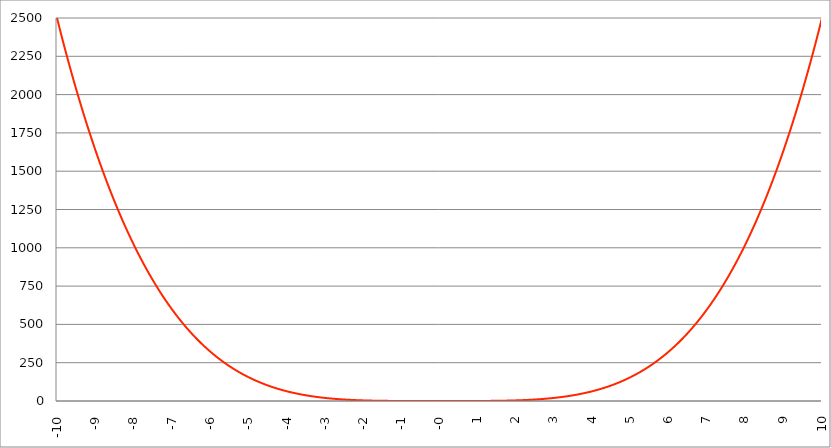
| Category | Series 1 |
|---|---|
| -10.0 | 2500 |
| -9.99 | 2490.015 |
| -9.98 | 2480.06 |
| -9.97 | 2470.135 |
| -9.96 | 2460.239 |
| -9.95 | 2450.374 |
| -9.940000000000001 | 2440.538 |
| -9.930000000000001 | 2430.732 |
| -9.920000000000002 | 2420.955 |
| -9.91 | 2411.208 |
| -9.900000000000002 | 2401.49 |
| -9.890000000000002 | 2391.802 |
| -9.880000000000003 | 2382.143 |
| -9.870000000000003 | 2372.513 |
| -9.860000000000001 | 2362.913 |
| -9.850000000000003 | 2353.341 |
| -9.840000000000003 | 2343.799 |
| -9.830000000000004 | 2334.286 |
| -9.820000000000004 | 2324.802 |
| -9.810000000000004 | 2315.347 |
| -9.800000000000004 | 2305.92 |
| -9.790000000000004 | 2296.523 |
| -9.780000000000005 | 2287.154 |
| -9.770000000000005 | 2277.814 |
| -9.760000000000005 | 2268.503 |
| -9.750000000000005 | 2259.22 |
| -9.740000000000006 | 2249.965 |
| -9.730000000000006 | 2240.739 |
| -9.720000000000006 | 2231.542 |
| -9.710000000000006 | 2222.373 |
| -9.700000000000006 | 2213.232 |
| -9.690000000000007 | 2204.119 |
| -9.680000000000007 | 2195.035 |
| -9.670000000000007 | 2185.979 |
| -9.660000000000007 | 2176.95 |
| -9.650000000000007 | 2167.95 |
| -9.640000000000008 | 2158.978 |
| -9.630000000000008 | 2150.033 |
| -9.620000000000008 | 2141.116 |
| -9.610000000000008 | 2132.228 |
| -9.600000000000009 | 2123.366 |
| -9.590000000000009 | 2114.533 |
| -9.580000000000007 | 2105.727 |
| -9.57000000000001 | 2096.948 |
| -9.56000000000001 | 2088.198 |
| -9.55000000000001 | 2079.474 |
| -9.54000000000001 | 2070.778 |
| -9.53000000000001 | 2062.109 |
| -9.52000000000001 | 2053.467 |
| -9.51000000000001 | 2044.853 |
| -9.50000000000001 | 2036.266 |
| -9.49000000000001 | 2027.705 |
| -9.48000000000001 | 2019.172 |
| -9.47000000000001 | 2010.666 |
| -9.46000000000001 | 2002.187 |
| -9.45000000000001 | 1993.734 |
| -9.44000000000001 | 1985.308 |
| -9.430000000000012 | 1976.909 |
| -9.420000000000012 | 1968.537 |
| -9.410000000000013 | 1960.192 |
| -9.400000000000013 | 1951.872 |
| -9.390000000000011 | 1943.58 |
| -9.380000000000013 | 1935.314 |
| -9.370000000000013 | 1927.074 |
| -9.360000000000014 | 1918.861 |
| -9.350000000000014 | 1910.673 |
| -9.340000000000014 | 1902.512 |
| -9.330000000000014 | 1894.378 |
| -9.320000000000014 | 1886.269 |
| -9.310000000000015 | 1878.187 |
| -9.300000000000013 | 1870.13 |
| -9.290000000000015 | 1862.099 |
| -9.280000000000015 | 1854.095 |
| -9.270000000000016 | 1846.116 |
| -9.260000000000016 | 1838.163 |
| -9.250000000000014 | 1830.235 |
| -9.240000000000016 | 1822.334 |
| -9.230000000000016 | 1814.458 |
| -9.220000000000017 | 1806.607 |
| -9.210000000000017 | 1798.782 |
| -9.200000000000017 | 1790.982 |
| -9.190000000000017 | 1783.208 |
| -9.180000000000017 | 1775.459 |
| -9.170000000000018 | 1767.736 |
| -9.160000000000016 | 1760.037 |
| -9.150000000000018 | 1752.364 |
| -9.140000000000018 | 1744.716 |
| -9.130000000000019 | 1737.093 |
| -9.120000000000019 | 1729.495 |
| -9.110000000000017 | 1721.922 |
| -9.10000000000002 | 1714.374 |
| -9.09000000000002 | 1706.851 |
| -9.08000000000002 | 1699.352 |
| -9.07000000000002 | 1691.878 |
| -9.06000000000002 | 1684.429 |
| -9.05000000000002 | 1677.005 |
| -9.04000000000002 | 1669.605 |
| -9.03000000000002 | 1662.23 |
| -9.020000000000021 | 1654.879 |
| -9.010000000000021 | 1647.552 |
| -9.000000000000021 | 1640.25 |
| -8.990000000000022 | 1632.972 |
| -8.980000000000022 | 1625.719 |
| -8.97000000000002 | 1618.489 |
| -8.960000000000022 | 1611.284 |
| -8.950000000000022 | 1604.103 |
| -8.940000000000023 | 1596.945 |
| -8.930000000000023 | 1589.812 |
| -8.920000000000023 | 1582.703 |
| -8.910000000000023 | 1575.618 |
| -8.900000000000023 | 1568.556 |
| -8.890000000000024 | 1561.518 |
| -8.880000000000024 | 1554.504 |
| -8.870000000000024 | 1547.514 |
| -8.860000000000024 | 1540.547 |
| -8.850000000000025 | 1533.604 |
| -8.840000000000025 | 1526.684 |
| -8.830000000000025 | 1519.787 |
| -8.820000000000025 | 1512.914 |
| -8.810000000000025 | 1506.065 |
| -8.800000000000026 | 1499.238 |
| -8.790000000000026 | 1492.435 |
| -8.780000000000026 | 1485.655 |
| -8.770000000000026 | 1478.899 |
| -8.760000000000026 | 1472.165 |
| -8.750000000000027 | 1465.454 |
| -8.740000000000027 | 1458.766 |
| -8.730000000000027 | 1452.102 |
| -8.720000000000027 | 1445.46 |
| -8.710000000000027 | 1438.84 |
| -8.700000000000028 | 1432.244 |
| -8.690000000000028 | 1425.67 |
| -8.680000000000028 | 1419.119 |
| -8.670000000000028 | 1412.591 |
| -8.660000000000029 | 1406.085 |
| -8.650000000000029 | 1399.602 |
| -8.640000000000029 | 1393.141 |
| -8.63000000000003 | 1386.702 |
| -8.62000000000003 | 1380.286 |
| -8.61000000000003 | 1373.892 |
| -8.60000000000003 | 1367.52 |
| -8.59000000000003 | 1361.171 |
| -8.58000000000003 | 1354.844 |
| -8.57000000000003 | 1348.538 |
| -8.56000000000003 | 1342.255 |
| -8.55000000000003 | 1335.994 |
| -8.540000000000031 | 1329.755 |
| -8.530000000000031 | 1323.537 |
| -8.520000000000032 | 1317.342 |
| -8.510000000000032 | 1311.168 |
| -8.50000000000003 | 1305.016 |
| -8.490000000000032 | 1298.885 |
| -8.480000000000032 | 1292.776 |
| -8.470000000000033 | 1286.689 |
| -8.460000000000033 | 1280.623 |
| -8.450000000000033 | 1274.579 |
| -8.440000000000033 | 1268.556 |
| -8.430000000000033 | 1262.555 |
| -8.420000000000034 | 1256.575 |
| -8.410000000000032 | 1250.616 |
| -8.400000000000034 | 1244.678 |
| -8.390000000000034 | 1238.762 |
| -8.380000000000035 | 1232.867 |
| -8.370000000000035 | 1226.992 |
| -8.360000000000033 | 1221.139 |
| -8.350000000000035 | 1215.307 |
| -8.340000000000035 | 1209.495 |
| -8.330000000000036 | 1203.705 |
| -8.320000000000036 | 1197.935 |
| -8.310000000000034 | 1192.186 |
| -8.300000000000036 | 1186.458 |
| -8.290000000000036 | 1180.75 |
| -8.280000000000037 | 1175.064 |
| -8.270000000000037 | 1169.397 |
| -8.260000000000037 | 1163.751 |
| -8.250000000000037 | 1158.126 |
| -8.240000000000038 | 1152.521 |
| -8.230000000000038 | 1146.936 |
| -8.220000000000038 | 1141.372 |
| -8.210000000000038 | 1135.828 |
| -8.200000000000038 | 1130.304 |
| -8.190000000000039 | 1124.801 |
| -8.180000000000039 | 1119.317 |
| -8.170000000000037 | 1113.854 |
| -8.16000000000004 | 1108.411 |
| -8.15000000000004 | 1102.987 |
| -8.14000000000004 | 1097.584 |
| -8.13000000000004 | 1092.2 |
| -8.12000000000004 | 1086.836 |
| -8.11000000000004 | 1081.492 |
| -8.10000000000004 | 1076.168 |
| -8.09000000000004 | 1070.863 |
| -8.08000000000004 | 1065.579 |
| -8.07000000000004 | 1060.313 |
| -8.06000000000004 | 1055.067 |
| -8.05000000000004 | 1049.841 |
| -8.040000000000042 | 1044.634 |
| -8.03000000000004 | 1039.447 |
| -8.020000000000042 | 1034.278 |
| -8.010000000000042 | 1029.13 |
| -8.000000000000043 | 1024 |
| -7.990000000000043 | 1018.89 |
| -7.980000000000043 | 1013.798 |
| -7.970000000000043 | 1008.726 |
| -7.960000000000043 | 1003.673 |
| -7.950000000000044 | 998.639 |
| -7.940000000000044 | 993.624 |
| -7.930000000000044 | 988.628 |
| -7.920000000000044 | 983.65 |
| -7.910000000000044 | 978.692 |
| -7.900000000000044 | 973.752 |
| -7.890000000000045 | 968.831 |
| -7.880000000000045 | 963.929 |
| -7.870000000000045 | 959.045 |
| -7.860000000000046 | 954.18 |
| -7.850000000000046 | 949.333 |
| -7.840000000000046 | 944.505 |
| -7.830000000000046 | 939.695 |
| -7.820000000000046 | 934.904 |
| -7.810000000000047 | 930.131 |
| -7.800000000000047 | 925.376 |
| -7.790000000000047 | 920.64 |
| -7.780000000000047 | 915.922 |
| -7.770000000000047 | 911.222 |
| -7.760000000000048 | 906.54 |
| -7.750000000000048 | 901.876 |
| -7.740000000000048 | 897.23 |
| -7.730000000000048 | 892.602 |
| -7.720000000000049 | 887.992 |
| -7.710000000000049 | 883.4 |
| -7.700000000000049 | 878.826 |
| -7.690000000000049 | 874.27 |
| -7.680000000000049 | 869.731 |
| -7.67000000000005 | 865.21 |
| -7.66000000000005 | 860.707 |
| -7.65000000000005 | 856.221 |
| -7.64000000000005 | 851.753 |
| -7.63000000000005 | 847.302 |
| -7.620000000000051 | 842.869 |
| -7.610000000000051 | 838.453 |
| -7.600000000000051 | 834.054 |
| -7.590000000000051 | 829.673 |
| -7.580000000000052 | 825.309 |
| -7.570000000000052 | 820.963 |
| -7.560000000000052 | 816.633 |
| -7.550000000000052 | 812.321 |
| -7.540000000000052 | 808.026 |
| -7.530000000000053 | 803.748 |
| -7.520000000000053 | 799.487 |
| -7.510000000000053 | 795.243 |
| -7.500000000000053 | 791.016 |
| -7.490000000000053 | 786.805 |
| -7.480000000000054 | 782.612 |
| -7.470000000000054 | 778.435 |
| -7.460000000000054 | 774.275 |
| -7.450000000000054 | 770.132 |
| -7.440000000000054 | 766.005 |
| -7.430000000000054 | 761.895 |
| -7.420000000000055 | 757.802 |
| -7.410000000000055 | 753.725 |
| -7.400000000000055 | 749.664 |
| -7.390000000000056 | 745.62 |
| -7.380000000000056 | 741.593 |
| -7.370000000000056 | 737.581 |
| -7.360000000000056 | 733.586 |
| -7.350000000000056 | 729.608 |
| -7.340000000000057 | 725.645 |
| -7.330000000000057 | 721.699 |
| -7.320000000000057 | 717.768 |
| -7.310000000000057 | 713.854 |
| -7.300000000000058 | 709.956 |
| -7.290000000000058 | 706.074 |
| -7.280000000000058 | 702.208 |
| -7.270000000000058 | 698.357 |
| -7.260000000000058 | 694.523 |
| -7.250000000000059 | 690.704 |
| -7.240000000000059 | 686.901 |
| -7.23000000000006 | 683.114 |
| -7.220000000000059 | 679.343 |
| -7.210000000000059 | 675.587 |
| -7.20000000000006 | 671.846 |
| -7.19000000000006 | 668.122 |
| -7.18000000000006 | 664.412 |
| -7.17000000000006 | 660.719 |
| -7.160000000000061 | 657.04 |
| -7.150000000000061 | 653.378 |
| -7.140000000000061 | 649.73 |
| -7.130000000000061 | 646.098 |
| -7.120000000000061 | 642.481 |
| -7.110000000000062 | 638.879 |
| -7.100000000000062 | 635.292 |
| -7.090000000000062 | 631.72 |
| -7.080000000000062 | 628.164 |
| -7.070000000000062 | 624.623 |
| -7.060000000000063 | 621.096 |
| -7.050000000000063 | 617.585 |
| -7.040000000000063 | 614.088 |
| -7.030000000000063 | 610.606 |
| -7.020000000000064 | 607.139 |
| -7.010000000000064 | 603.687 |
| -7.000000000000064 | 600.25 |
| -6.990000000000064 | 596.827 |
| -6.980000000000064 | 593.419 |
| -6.970000000000064 | 590.026 |
| -6.960000000000064 | 586.647 |
| -6.950000000000064 | 583.283 |
| -6.940000000000065 | 579.933 |
| -6.930000000000065 | 576.598 |
| -6.920000000000065 | 573.277 |
| -6.910000000000065 | 569.97 |
| -6.900000000000066 | 566.678 |
| -6.890000000000066 | 563.4 |
| -6.880000000000066 | 560.136 |
| -6.870000000000066 | 556.887 |
| -6.860000000000067 | 553.651 |
| -6.850000000000067 | 550.43 |
| -6.840000000000067 | 547.223 |
| -6.830000000000067 | 544.03 |
| -6.820000000000068 | 540.851 |
| -6.810000000000068 | 537.686 |
| -6.800000000000068 | 534.534 |
| -6.790000000000068 | 531.397 |
| -6.780000000000068 | 528.273 |
| -6.770000000000068 | 525.164 |
| -6.760000000000069 | 522.068 |
| -6.75000000000007 | 518.985 |
| -6.74000000000007 | 515.917 |
| -6.73000000000007 | 512.862 |
| -6.72000000000007 | 509.82 |
| -6.71000000000007 | 506.792 |
| -6.70000000000007 | 503.778 |
| -6.69000000000007 | 500.777 |
| -6.680000000000071 | 497.79 |
| -6.670000000000071 | 494.816 |
| -6.660000000000071 | 491.855 |
| -6.650000000000071 | 488.907 |
| -6.640000000000072 | 485.973 |
| -6.630000000000072 | 483.052 |
| -6.620000000000072 | 480.145 |
| -6.610000000000072 | 477.25 |
| -6.600000000000072 | 474.368 |
| -6.590000000000073 | 471.5 |
| -6.580000000000073 | 468.645 |
| -6.570000000000073 | 465.802 |
| -6.560000000000073 | 462.973 |
| -6.550000000000074 | 460.156 |
| -6.540000000000074 | 457.352 |
| -6.530000000000074 | 454.562 |
| -6.520000000000074 | 451.784 |
| -6.510000000000074 | 449.018 |
| -6.500000000000074 | 446.266 |
| -6.490000000000074 | 443.526 |
| -6.480000000000074 | 440.798 |
| -6.470000000000075 | 438.084 |
| -6.460000000000075 | 435.382 |
| -6.450000000000075 | 432.692 |
| -6.440000000000075 | 430.015 |
| -6.430000000000076 | 427.35 |
| -6.420000000000076 | 424.698 |
| -6.410000000000076 | 422.058 |
| -6.400000000000076 | 419.43 |
| -6.390000000000077 | 416.815 |
| -6.380000000000077 | 414.212 |
| -6.370000000000077 | 411.621 |
| -6.360000000000078 | 409.043 |
| -6.350000000000078 | 406.476 |
| -6.340000000000078 | 403.922 |
| -6.330000000000078 | 401.379 |
| -6.320000000000078 | 398.849 |
| -6.310000000000079 | 396.33 |
| -6.300000000000079 | 393.824 |
| -6.29000000000008 | 391.33 |
| -6.28000000000008 | 388.847 |
| -6.27000000000008 | 386.376 |
| -6.26000000000008 | 383.917 |
| -6.25000000000008 | 381.47 |
| -6.24000000000008 | 379.034 |
| -6.23000000000008 | 376.61 |
| -6.220000000000081 | 374.198 |
| -6.210000000000081 | 371.797 |
| -6.200000000000081 | 369.408 |
| -6.190000000000081 | 367.031 |
| -6.180000000000081 | 364.665 |
| -6.170000000000082 | 362.31 |
| -6.160000000000082 | 359.967 |
| -6.150000000000082 | 357.635 |
| -6.140000000000082 | 355.315 |
| -6.130000000000082 | 353.006 |
| -6.120000000000083 | 350.708 |
| -6.110000000000083 | 348.421 |
| -6.100000000000083 | 346.146 |
| -6.090000000000083 | 343.882 |
| -6.080000000000084 | 341.629 |
| -6.070000000000084 | 339.387 |
| -6.060000000000084 | 337.156 |
| -6.050000000000084 | 334.936 |
| -6.040000000000084 | 332.727 |
| -6.030000000000084 | 330.529 |
| -6.020000000000085 | 328.342 |
| -6.010000000000085 | 326.165 |
| -6.000000000000085 | 324 |
| -5.990000000000085 | 321.845 |
| -5.980000000000085 | 319.702 |
| -5.970000000000085 | 317.568 |
| -5.960000000000086 | 315.446 |
| -5.950000000000086 | 313.334 |
| -5.940000000000086 | 311.233 |
| -5.930000000000086 | 309.143 |
| -5.920000000000087 | 307.063 |
| -5.910000000000087 | 304.993 |
| -5.900000000000087 | 302.934 |
| -5.890000000000088 | 300.885 |
| -5.880000000000088 | 298.847 |
| -5.870000000000088 | 296.819 |
| -5.860000000000088 | 294.802 |
| -5.850000000000088 | 292.795 |
| -5.840000000000089 | 290.798 |
| -5.830000000000089 | 288.811 |
| -5.820000000000089 | 286.835 |
| -5.810000000000089 | 284.869 |
| -5.800000000000089 | 282.912 |
| -5.79000000000009 | 280.966 |
| -5.78000000000009 | 279.03 |
| -5.77000000000009 | 277.104 |
| -5.76000000000009 | 275.188 |
| -5.750000000000091 | 273.282 |
| -5.740000000000091 | 271.386 |
| -5.730000000000091 | 269.5 |
| -5.720000000000091 | 267.623 |
| -5.710000000000091 | 265.757 |
| -5.700000000000092 | 263.9 |
| -5.690000000000092 | 262.053 |
| -5.680000000000092 | 260.216 |
| -5.670000000000092 | 258.388 |
| -5.660000000000092 | 256.57 |
| -5.650000000000093 | 254.762 |
| -5.640000000000093 | 252.963 |
| -5.630000000000093 | 251.173 |
| -5.620000000000093 | 249.394 |
| -5.610000000000093 | 247.623 |
| -5.600000000000094 | 245.862 |
| -5.590000000000094 | 244.111 |
| -5.580000000000094 | 242.369 |
| -5.570000000000094 | 240.636 |
| -5.560000000000095 | 238.913 |
| -5.550000000000095 | 237.199 |
| -5.540000000000095 | 235.494 |
| -5.530000000000095 | 233.798 |
| -5.520000000000095 | 232.111 |
| -5.510000000000096 | 230.434 |
| -5.500000000000096 | 228.766 |
| -5.490000000000096 | 227.106 |
| -5.480000000000096 | 225.456 |
| -5.470000000000096 | 223.815 |
| -5.460000000000097 | 222.183 |
| -5.450000000000097 | 220.56 |
| -5.440000000000097 | 218.945 |
| -5.430000000000097 | 217.34 |
| -5.420000000000098 | 215.743 |
| -5.410000000000098 | 214.155 |
| -5.400000000000098 | 212.576 |
| -5.390000000000098 | 211.006 |
| -5.380000000000098 | 209.445 |
| -5.370000000000099 | 207.892 |
| -5.360000000000099 | 206.347 |
| -5.350000000000099 | 204.812 |
| -5.340000000000099 | 203.285 |
| -5.330000000000099 | 201.766 |
| -5.3200000000001 | 200.256 |
| -5.3100000000001 | 198.755 |
| -5.3000000000001 | 197.262 |
| -5.2900000000001 | 195.777 |
| -5.2800000000001 | 194.301 |
| -5.2700000000001 | 192.833 |
| -5.260000000000101 | 191.374 |
| -5.250000000000101 | 189.923 |
| -5.240000000000101 | 188.48 |
| -5.230000000000101 | 187.045 |
| -5.220000000000102 | 185.619 |
| -5.210000000000102 | 184.201 |
| -5.200000000000102 | 182.79 |
| -5.190000000000103 | 181.388 |
| -5.180000000000103 | 179.994 |
| -5.170000000000103 | 178.609 |
| -5.160000000000103 | 177.231 |
| -5.150000000000103 | 175.861 |
| -5.140000000000104 | 174.499 |
| -5.130000000000104 | 173.145 |
| -5.120000000000104 | 171.799 |
| -5.110000000000104 | 170.46 |
| -5.100000000000104 | 169.13 |
| -5.090000000000104 | 167.807 |
| -5.080000000000104 | 166.493 |
| -5.070000000000105 | 165.185 |
| -5.060000000000105 | 163.886 |
| -5.050000000000105 | 162.594 |
| -5.040000000000105 | 161.31 |
| -5.030000000000105 | 160.034 |
| -5.020000000000106 | 158.765 |
| -5.010000000000106 | 157.504 |
| -5.000000000000106 | 156.25 |
| -4.990000000000106 | 155.004 |
| -4.980000000000106 | 153.765 |
| -4.970000000000107 | 152.534 |
| -4.960000000000107 | 151.31 |
| -4.950000000000107 | 150.093 |
| -4.940000000000107 | 148.884 |
| -4.930000000000108 | 147.682 |
| -4.920000000000108 | 146.487 |
| -4.910000000000108 | 145.3 |
| -4.900000000000108 | 144.12 |
| -4.890000000000109 | 142.947 |
| -4.88000000000011 | 141.781 |
| -4.87000000000011 | 140.623 |
| -4.86000000000011 | 139.471 |
| -4.85000000000011 | 138.327 |
| -4.84000000000011 | 137.19 |
| -4.83000000000011 | 136.059 |
| -4.82000000000011 | 134.936 |
| -4.810000000000111 | 133.82 |
| -4.800000000000111 | 132.71 |
| -4.790000000000111 | 131.608 |
| -4.780000000000111 | 130.512 |
| -4.770000000000111 | 129.424 |
| -4.760000000000112 | 128.342 |
| -4.750000000000112 | 127.267 |
| -4.740000000000112 | 126.198 |
| -4.730000000000112 | 125.137 |
| -4.720000000000112 | 124.082 |
| -4.710000000000113 | 123.034 |
| -4.700000000000113 | 121.992 |
| -4.690000000000113 | 120.957 |
| -4.680000000000113 | 119.929 |
| -4.670000000000114 | 118.907 |
| -4.660000000000114 | 117.892 |
| -4.650000000000114 | 116.883 |
| -4.640000000000114 | 115.881 |
| -4.630000000000114 | 114.885 |
| -4.620000000000115 | 113.896 |
| -4.610000000000115 | 112.913 |
| -4.600000000000115 | 111.936 |
| -4.590000000000115 | 110.966 |
| -4.580000000000115 | 110.002 |
| -4.570000000000115 | 109.045 |
| -4.560000000000116 | 108.093 |
| -4.550000000000116 | 107.148 |
| -4.540000000000116 | 106.21 |
| -4.530000000000116 | 105.277 |
| -4.520000000000117 | 104.35 |
| -4.510000000000117 | 103.43 |
| -4.500000000000117 | 102.516 |
| -4.490000000000117 | 101.607 |
| -4.480000000000117 | 100.705 |
| -4.470000000000117 | 99.809 |
| -4.460000000000118 | 98.919 |
| -4.450000000000118 | 98.035 |
| -4.440000000000118 | 97.157 |
| -4.430000000000118 | 96.284 |
| -4.420000000000119 | 95.418 |
| -4.41000000000012 | 94.557 |
| -4.40000000000012 | 93.702 |
| -4.39000000000012 | 92.853 |
| -4.38000000000012 | 92.01 |
| -4.37000000000012 | 91.173 |
| -4.36000000000012 | 90.341 |
| -4.35000000000012 | 89.515 |
| -4.34000000000012 | 88.695 |
| -4.33000000000012 | 87.88 |
| -4.320000000000121 | 87.071 |
| -4.310000000000121 | 86.268 |
| -4.300000000000121 | 85.47 |
| -4.290000000000121 | 84.678 |
| -4.280000000000121 | 83.891 |
| -4.270000000000122 | 83.11 |
| -4.260000000000122 | 82.334 |
| -4.250000000000122 | 81.563 |
| -4.240000000000122 | 80.799 |
| -4.230000000000122 | 80.039 |
| -4.220000000000123 | 79.285 |
| -4.210000000000123 | 78.536 |
| -4.200000000000123 | 77.792 |
| -4.190000000000124 | 77.054 |
| -4.180000000000124 | 76.321 |
| -4.170000000000124 | 75.593 |
| -4.160000000000124 | 74.871 |
| -4.150000000000124 | 74.154 |
| -4.140000000000124 | 73.441 |
| -4.130000000000125 | 72.734 |
| -4.120000000000125 | 72.033 |
| -4.110000000000125 | 71.336 |
| -4.100000000000125 | 70.644 |
| -4.090000000000125 | 69.957 |
| -4.080000000000126 | 69.276 |
| -4.070000000000126 | 68.599 |
| -4.060000000000126 | 67.927 |
| -4.050000000000126 | 67.261 |
| -4.040000000000127 | 66.599 |
| -4.030000000000127 | 65.942 |
| -4.020000000000127 | 65.29 |
| -4.010000000000127 | 64.642 |
| -4.000000000000127 | 64 |
| -3.990000000000128 | 63.362 |
| -3.980000000000128 | 62.73 |
| -3.970000000000129 | 62.101 |
| -3.960000000000129 | 61.478 |
| -3.950000000000129 | 60.86 |
| -3.940000000000129 | 60.246 |
| -3.930000000000129 | 59.636 |
| -3.92000000000013 | 59.032 |
| -3.91000000000013 | 58.432 |
| -3.90000000000013 | 57.836 |
| -3.89000000000013 | 57.245 |
| -3.88000000000013 | 56.659 |
| -3.870000000000131 | 56.077 |
| -3.860000000000131 | 55.5 |
| -3.850000000000131 | 54.927 |
| -3.840000000000131 | 54.358 |
| -3.830000000000131 | 53.794 |
| -3.820000000000132 | 53.235 |
| -3.810000000000132 | 52.679 |
| -3.800000000000132 | 52.128 |
| -3.790000000000132 | 51.582 |
| -3.780000000000132 | 51.04 |
| -3.770000000000133 | 50.502 |
| -3.760000000000133 | 49.968 |
| -3.750000000000133 | 49.438 |
| -3.740000000000133 | 48.913 |
| -3.730000000000134 | 48.392 |
| -3.720000000000134 | 47.875 |
| -3.710000000000134 | 47.363 |
| -3.700000000000134 | 46.854 |
| -3.690000000000134 | 46.35 |
| -3.680000000000135 | 45.849 |
| -3.670000000000135 | 45.353 |
| -3.660000000000135 | 44.861 |
| -3.650000000000135 | 44.372 |
| -3.640000000000135 | 43.888 |
| -3.630000000000136 | 43.408 |
| -3.620000000000136 | 42.931 |
| -3.610000000000136 | 42.459 |
| -3.600000000000136 | 41.99 |
| -3.590000000000137 | 41.526 |
| -3.580000000000137 | 41.065 |
| -3.570000000000137 | 40.608 |
| -3.560000000000137 | 40.155 |
| -3.550000000000137 | 39.706 |
| -3.540000000000138 | 39.26 |
| -3.530000000000138 | 38.819 |
| -3.520000000000138 | 38.381 |
| -3.510000000000138 | 37.946 |
| -3.500000000000139 | 37.516 |
| -3.490000000000139 | 37.089 |
| -3.480000000000139 | 36.665 |
| -3.470000000000139 | 36.246 |
| -3.460000000000139 | 35.83 |
| -3.45000000000014 | 35.417 |
| -3.44000000000014 | 35.009 |
| -3.43000000000014 | 34.603 |
| -3.42000000000014 | 34.201 |
| -3.41000000000014 | 33.803 |
| -3.400000000000141 | 33.408 |
| -3.390000000000141 | 33.017 |
| -3.380000000000141 | 32.629 |
| -3.370000000000141 | 32.245 |
| -3.360000000000141 | 31.864 |
| -3.350000000000142 | 31.486 |
| -3.340000000000142 | 31.112 |
| -3.330000000000142 | 30.741 |
| -3.320000000000142 | 30.373 |
| -3.310000000000143 | 30.009 |
| -3.300000000000143 | 29.648 |
| -3.290000000000143 | 29.29 |
| -3.280000000000143 | 28.936 |
| -3.270000000000143 | 28.585 |
| -3.260000000000144 | 28.236 |
| -3.250000000000144 | 27.892 |
| -3.240000000000144 | 27.55 |
| -3.230000000000144 | 27.211 |
| -3.220000000000145 | 26.876 |
| -3.210000000000145 | 26.544 |
| -3.200000000000145 | 26.214 |
| -3.190000000000145 | 25.888 |
| -3.180000000000145 | 25.565 |
| -3.170000000000146 | 25.245 |
| -3.160000000000146 | 24.928 |
| -3.150000000000146 | 24.614 |
| -3.140000000000146 | 24.303 |
| -3.130000000000146 | 23.995 |
| -3.120000000000147 | 23.69 |
| -3.110000000000147 | 23.387 |
| -3.100000000000147 | 23.088 |
| -3.090000000000147 | 22.792 |
| -3.080000000000147 | 22.498 |
| -3.070000000000148 | 22.207 |
| -3.060000000000148 | 21.919 |
| -3.050000000000148 | 21.634 |
| -3.040000000000148 | 21.352 |
| -3.030000000000149 | 21.072 |
| -3.020000000000149 | 20.795 |
| -3.010000000000149 | 20.521 |
| -3.000000000000149 | 20.25 |
| -2.990000000000149 | 19.981 |
| -2.98000000000015 | 19.715 |
| -2.97000000000015 | 19.452 |
| -2.96000000000015 | 19.191 |
| -2.95000000000015 | 18.933 |
| -2.94000000000015 | 18.678 |
| -2.930000000000151 | 18.425 |
| -2.920000000000151 | 18.175 |
| -2.910000000000151 | 17.927 |
| -2.900000000000151 | 17.682 |
| -2.890000000000151 | 17.439 |
| -2.880000000000152 | 17.199 |
| -2.870000000000152 | 16.962 |
| -2.860000000000152 | 16.726 |
| -2.850000000000152 | 16.494 |
| -2.840000000000153 | 16.263 |
| -2.830000000000153 | 16.036 |
| -2.820000000000153 | 15.81 |
| -2.810000000000153 | 15.587 |
| -2.800000000000153 | 15.366 |
| -2.790000000000154 | 15.148 |
| -2.780000000000154 | 14.932 |
| -2.770000000000154 | 14.718 |
| -2.760000000000154 | 14.507 |
| -2.750000000000154 | 14.298 |
| -2.740000000000155 | 14.091 |
| -2.730000000000155 | 13.886 |
| -2.720000000000155 | 13.684 |
| -2.710000000000155 | 13.484 |
| -2.700000000000156 | 13.286 |
| -2.690000000000156 | 13.09 |
| -2.680000000000156 | 12.897 |
| -2.670000000000156 | 12.705 |
| -2.660000000000156 | 12.516 |
| -2.650000000000157 | 12.329 |
| -2.640000000000157 | 12.144 |
| -2.630000000000157 | 11.961 |
| -2.620000000000157 | 11.78 |
| -2.610000000000157 | 11.601 |
| -2.600000000000158 | 11.424 |
| -2.590000000000158 | 11.25 |
| -2.580000000000158 | 11.077 |
| -2.570000000000158 | 10.906 |
| -2.560000000000159 | 10.737 |
| -2.550000000000159 | 10.571 |
| -2.54000000000016 | 10.406 |
| -2.530000000000159 | 10.243 |
| -2.520000000000159 | 10.082 |
| -2.51000000000016 | 9.923 |
| -2.50000000000016 | 9.766 |
| -2.49000000000016 | 9.61 |
| -2.48000000000016 | 9.457 |
| -2.47000000000016 | 9.305 |
| -2.460000000000161 | 9.155 |
| -2.450000000000161 | 9.008 |
| -2.440000000000161 | 8.861 |
| -2.430000000000161 | 8.717 |
| -2.420000000000162 | 8.574 |
| -2.410000000000162 | 8.434 |
| -2.400000000000162 | 8.294 |
| -2.390000000000162 | 8.157 |
| -2.380000000000162 | 8.021 |
| -2.370000000000163 | 7.887 |
| -2.360000000000163 | 7.755 |
| -2.350000000000163 | 7.625 |
| -2.340000000000163 | 7.496 |
| -2.330000000000163 | 7.368 |
| -2.320000000000164 | 7.243 |
| -2.310000000000164 | 7.118 |
| -2.300000000000164 | 6.996 |
| -2.290000000000164 | 6.875 |
| -2.280000000000165 | 6.756 |
| -2.270000000000165 | 6.638 |
| -2.260000000000165 | 6.522 |
| -2.250000000000165 | 6.407 |
| -2.240000000000165 | 6.294 |
| -2.230000000000166 | 6.182 |
| -2.220000000000166 | 6.072 |
| -2.210000000000166 | 5.964 |
| -2.200000000000166 | 5.856 |
| -2.190000000000166 | 5.751 |
| -2.180000000000167 | 5.646 |
| -2.170000000000167 | 5.543 |
| -2.160000000000167 | 5.442 |
| -2.150000000000167 | 5.342 |
| -2.140000000000168 | 5.243 |
| -2.130000000000168 | 5.146 |
| -2.120000000000168 | 5.05 |
| -2.110000000000168 | 4.955 |
| -2.100000000000168 | 4.862 |
| -2.090000000000169 | 4.77 |
| -2.080000000000169 | 4.679 |
| -2.070000000000169 | 4.59 |
| -2.060000000000169 | 4.502 |
| -2.050000000000169 | 4.415 |
| -2.04000000000017 | 4.33 |
| -2.03000000000017 | 4.245 |
| -2.02000000000017 | 4.162 |
| -2.01000000000017 | 4.081 |
| -2.000000000000171 | 4 |
| -1.99000000000017 | 3.921 |
| -1.98000000000017 | 3.842 |
| -1.97000000000017 | 3.765 |
| -1.96000000000017 | 3.689 |
| -1.95000000000017 | 3.615 |
| -1.94000000000017 | 3.541 |
| -1.93000000000017 | 3.469 |
| -1.92000000000017 | 3.397 |
| -1.91000000000017 | 3.327 |
| -1.90000000000017 | 3.258 |
| -1.89000000000017 | 3.19 |
| -1.88000000000017 | 3.123 |
| -1.87000000000017 | 3.057 |
| -1.86000000000017 | 2.992 |
| -1.85000000000017 | 2.928 |
| -1.84000000000017 | 2.866 |
| -1.83000000000017 | 2.804 |
| -1.82000000000017 | 2.743 |
| -1.81000000000017 | 2.683 |
| -1.80000000000017 | 2.624 |
| -1.79000000000017 | 2.567 |
| -1.78000000000017 | 2.51 |
| -1.77000000000017 | 2.454 |
| -1.76000000000017 | 2.399 |
| -1.75000000000017 | 2.345 |
| -1.74000000000017 | 2.292 |
| -1.73000000000017 | 2.239 |
| -1.72000000000017 | 2.188 |
| -1.71000000000017 | 2.138 |
| -1.70000000000017 | 2.088 |
| -1.69000000000017 | 2.039 |
| -1.68000000000017 | 1.991 |
| -1.67000000000017 | 1.944 |
| -1.66000000000017 | 1.898 |
| -1.65000000000017 | 1.853 |
| -1.64000000000017 | 1.808 |
| -1.63000000000017 | 1.765 |
| -1.62000000000017 | 1.722 |
| -1.61000000000017 | 1.68 |
| -1.60000000000017 | 1.638 |
| -1.59000000000017 | 1.598 |
| -1.58000000000017 | 1.558 |
| -1.57000000000017 | 1.519 |
| -1.56000000000017 | 1.481 |
| -1.55000000000017 | 1.443 |
| -1.54000000000017 | 1.406 |
| -1.53000000000017 | 1.37 |
| -1.52000000000017 | 1.334 |
| -1.51000000000017 | 1.3 |
| -1.50000000000017 | 1.266 |
| -1.49000000000017 | 1.232 |
| -1.48000000000017 | 1.199 |
| -1.47000000000017 | 1.167 |
| -1.46000000000017 | 1.136 |
| -1.45000000000017 | 1.105 |
| -1.44000000000017 | 1.075 |
| -1.43000000000017 | 1.045 |
| -1.42000000000017 | 1.016 |
| -1.41000000000017 | 0.988 |
| -1.40000000000017 | 0.96 |
| -1.39000000000017 | 0.933 |
| -1.38000000000017 | 0.907 |
| -1.37000000000017 | 0.881 |
| -1.36000000000017 | 0.855 |
| -1.35000000000017 | 0.83 |
| -1.34000000000017 | 0.806 |
| -1.33000000000017 | 0.782 |
| -1.32000000000017 | 0.759 |
| -1.31000000000017 | 0.736 |
| -1.30000000000017 | 0.714 |
| -1.29000000000017 | 0.692 |
| -1.28000000000017 | 0.671 |
| -1.27000000000017 | 0.65 |
| -1.26000000000017 | 0.63 |
| -1.25000000000017 | 0.61 |
| -1.24000000000017 | 0.591 |
| -1.23000000000017 | 0.572 |
| -1.22000000000017 | 0.554 |
| -1.21000000000017 | 0.536 |
| -1.20000000000017 | 0.518 |
| -1.19000000000017 | 0.501 |
| -1.18000000000017 | 0.485 |
| -1.17000000000017 | 0.468 |
| -1.16000000000017 | 0.453 |
| -1.15000000000017 | 0.437 |
| -1.14000000000017 | 0.422 |
| -1.13000000000017 | 0.408 |
| -1.12000000000017 | 0.393 |
| -1.11000000000017 | 0.38 |
| -1.10000000000017 | 0.366 |
| -1.09000000000017 | 0.353 |
| -1.08000000000017 | 0.34 |
| -1.07000000000017 | 0.328 |
| -1.06000000000017 | 0.316 |
| -1.05000000000017 | 0.304 |
| -1.04000000000017 | 0.292 |
| -1.03000000000017 | 0.281 |
| -1.02000000000017 | 0.271 |
| -1.01000000000017 | 0.26 |
| -1.00000000000017 | 0.25 |
| -0.99000000000017 | 0.24 |
| -0.98000000000017 | 0.231 |
| -0.97000000000017 | 0.221 |
| -0.96000000000017 | 0.212 |
| -0.95000000000017 | 0.204 |
| -0.94000000000017 | 0.195 |
| -0.93000000000017 | 0.187 |
| -0.92000000000017 | 0.179 |
| -0.91000000000017 | 0.171 |
| -0.90000000000017 | 0.164 |
| -0.890000000000169 | 0.157 |
| -0.880000000000169 | 0.15 |
| -0.870000000000169 | 0.143 |
| -0.860000000000169 | 0.137 |
| -0.850000000000169 | 0.131 |
| -0.840000000000169 | 0.124 |
| -0.830000000000169 | 0.119 |
| -0.820000000000169 | 0.113 |
| -0.810000000000169 | 0.108 |
| -0.800000000000169 | 0.102 |
| -0.790000000000169 | 0.097 |
| -0.780000000000169 | 0.093 |
| -0.770000000000169 | 0.088 |
| -0.760000000000169 | 0.083 |
| -0.750000000000169 | 0.079 |
| -0.740000000000169 | 0.075 |
| -0.730000000000169 | 0.071 |
| -0.720000000000169 | 0.067 |
| -0.710000000000169 | 0.064 |
| -0.700000000000169 | 0.06 |
| -0.690000000000169 | 0.057 |
| -0.680000000000169 | 0.053 |
| -0.670000000000169 | 0.05 |
| -0.660000000000169 | 0.047 |
| -0.650000000000169 | 0.045 |
| -0.640000000000169 | 0.042 |
| -0.630000000000169 | 0.039 |
| -0.620000000000169 | 0.037 |
| -0.610000000000169 | 0.035 |
| -0.600000000000169 | 0.032 |
| -0.590000000000169 | 0.03 |
| -0.580000000000169 | 0.028 |
| -0.570000000000169 | 0.026 |
| -0.560000000000169 | 0.025 |
| -0.550000000000169 | 0.023 |
| -0.540000000000169 | 0.021 |
| -0.530000000000169 | 0.02 |
| -0.520000000000169 | 0.018 |
| -0.510000000000169 | 0.017 |
| -0.500000000000169 | 0.016 |
| -0.490000000000169 | 0.014 |
| -0.480000000000169 | 0.013 |
| -0.470000000000169 | 0.012 |
| -0.460000000000169 | 0.011 |
| -0.450000000000169 | 0.01 |
| -0.440000000000169 | 0.009 |
| -0.430000000000169 | 0.009 |
| -0.420000000000169 | 0.008 |
| -0.410000000000169 | 0.007 |
| -0.400000000000169 | 0.006 |
| -0.390000000000169 | 0.006 |
| -0.380000000000169 | 0.005 |
| -0.370000000000169 | 0.005 |
| -0.360000000000169 | 0.004 |
| -0.350000000000169 | 0.004 |
| -0.340000000000169 | 0.003 |
| -0.330000000000169 | 0.003 |
| -0.320000000000169 | 0.003 |
| -0.310000000000169 | 0.002 |
| -0.300000000000169 | 0.002 |
| -0.290000000000169 | 0.002 |
| -0.280000000000169 | 0.002 |
| -0.270000000000169 | 0.001 |
| -0.260000000000169 | 0.001 |
| -0.250000000000169 | 0.001 |
| -0.240000000000169 | 0.001 |
| -0.230000000000169 | 0.001 |
| -0.220000000000169 | 0.001 |
| -0.210000000000169 | 0 |
| -0.200000000000169 | 0 |
| -0.190000000000169 | 0 |
| -0.180000000000169 | 0 |
| -0.170000000000169 | 0 |
| -0.160000000000169 | 0 |
| -0.150000000000169 | 0 |
| -0.140000000000169 | 0 |
| -0.130000000000169 | 0 |
| -0.120000000000169 | 0 |
| -0.110000000000169 | 0 |
| -0.100000000000169 | 0 |
| -0.0900000000001689 | 0 |
| -0.0800000000001689 | 0 |
| -0.0700000000001689 | 0 |
| -0.0600000000001689 | 0 |
| -0.0500000000001689 | 0 |
| -0.0400000000001689 | 0 |
| -0.0300000000001689 | 0 |
| -0.0200000000001689 | 0 |
| -0.0100000000001689 | 0 |
| -1.6888920817415e-13 | 0 |
| 0.00999999999983111 | 0 |
| 0.0199999999998311 | 0 |
| 0.0299999999998311 | 0 |
| 0.0399999999998311 | 0 |
| 0.0499999999998311 | 0 |
| 0.0599999999998311 | 0 |
| 0.0699999999998311 | 0 |
| 0.0799999999998311 | 0 |
| 0.0899999999998311 | 0 |
| 0.0999999999998311 | 0 |
| 0.109999999999831 | 0 |
| 0.119999999999831 | 0 |
| 0.129999999999831 | 0 |
| 0.139999999999831 | 0 |
| 0.149999999999831 | 0 |
| 0.159999999999831 | 0 |
| 0.169999999999831 | 0 |
| 0.179999999999831 | 0 |
| 0.189999999999831 | 0 |
| 0.199999999999831 | 0 |
| 0.209999999999831 | 0 |
| 0.219999999999831 | 0.001 |
| 0.229999999999831 | 0.001 |
| 0.239999999999831 | 0.001 |
| 0.249999999999831 | 0.001 |
| 0.259999999999831 | 0.001 |
| 0.269999999999831 | 0.001 |
| 0.279999999999831 | 0.002 |
| 0.289999999999831 | 0.002 |
| 0.299999999999831 | 0.002 |
| 0.309999999999831 | 0.002 |
| 0.319999999999831 | 0.003 |
| 0.329999999999831 | 0.003 |
| 0.339999999999831 | 0.003 |
| 0.349999999999831 | 0.004 |
| 0.359999999999831 | 0.004 |
| 0.369999999999831 | 0.005 |
| 0.379999999999831 | 0.005 |
| 0.389999999999831 | 0.006 |
| 0.399999999999831 | 0.006 |
| 0.409999999999831 | 0.007 |
| 0.419999999999831 | 0.008 |
| 0.429999999999831 | 0.009 |
| 0.439999999999831 | 0.009 |
| 0.449999999999831 | 0.01 |
| 0.459999999999831 | 0.011 |
| 0.469999999999831 | 0.012 |
| 0.479999999999831 | 0.013 |
| 0.489999999999831 | 0.014 |
| 0.499999999999831 | 0.016 |
| 0.509999999999831 | 0.017 |
| 0.519999999999831 | 0.018 |
| 0.529999999999831 | 0.02 |
| 0.539999999999831 | 0.021 |
| 0.549999999999831 | 0.023 |
| 0.559999999999831 | 0.025 |
| 0.569999999999831 | 0.026 |
| 0.579999999999831 | 0.028 |
| 0.589999999999831 | 0.03 |
| 0.599999999999831 | 0.032 |
| 0.609999999999831 | 0.035 |
| 0.619999999999831 | 0.037 |
| 0.629999999999831 | 0.039 |
| 0.639999999999831 | 0.042 |
| 0.649999999999831 | 0.045 |
| 0.659999999999831 | 0.047 |
| 0.669999999999831 | 0.05 |
| 0.679999999999831 | 0.053 |
| 0.689999999999831 | 0.057 |
| 0.699999999999831 | 0.06 |
| 0.709999999999831 | 0.064 |
| 0.719999999999831 | 0.067 |
| 0.729999999999831 | 0.071 |
| 0.739999999999831 | 0.075 |
| 0.749999999999832 | 0.079 |
| 0.759999999999832 | 0.083 |
| 0.769999999999832 | 0.088 |
| 0.779999999999832 | 0.093 |
| 0.789999999999832 | 0.097 |
| 0.799999999999832 | 0.102 |
| 0.809999999999832 | 0.108 |
| 0.819999999999832 | 0.113 |
| 0.829999999999832 | 0.119 |
| 0.839999999999832 | 0.124 |
| 0.849999999999832 | 0.131 |
| 0.859999999999832 | 0.137 |
| 0.869999999999832 | 0.143 |
| 0.879999999999832 | 0.15 |
| 0.889999999999832 | 0.157 |
| 0.899999999999832 | 0.164 |
| 0.909999999999832 | 0.171 |
| 0.919999999999832 | 0.179 |
| 0.929999999999832 | 0.187 |
| 0.939999999999832 | 0.195 |
| 0.949999999999832 | 0.204 |
| 0.959999999999832 | 0.212 |
| 0.969999999999832 | 0.221 |
| 0.979999999999832 | 0.231 |
| 0.989999999999832 | 0.24 |
| 0.999999999999832 | 0.25 |
| 1.009999999999832 | 0.26 |
| 1.019999999999832 | 0.271 |
| 1.029999999999832 | 0.281 |
| 1.039999999999832 | 0.292 |
| 1.049999999999832 | 0.304 |
| 1.059999999999832 | 0.316 |
| 1.069999999999832 | 0.328 |
| 1.079999999999832 | 0.34 |
| 1.089999999999832 | 0.353 |
| 1.099999999999832 | 0.366 |
| 1.109999999999832 | 0.38 |
| 1.119999999999832 | 0.393 |
| 1.129999999999832 | 0.408 |
| 1.139999999999832 | 0.422 |
| 1.149999999999832 | 0.437 |
| 1.159999999999832 | 0.453 |
| 1.169999999999832 | 0.468 |
| 1.179999999999832 | 0.485 |
| 1.189999999999832 | 0.501 |
| 1.199999999999832 | 0.518 |
| 1.209999999999832 | 0.536 |
| 1.219999999999832 | 0.554 |
| 1.229999999999832 | 0.572 |
| 1.239999999999832 | 0.591 |
| 1.249999999999832 | 0.61 |
| 1.259999999999832 | 0.63 |
| 1.269999999999832 | 0.65 |
| 1.279999999999832 | 0.671 |
| 1.289999999999832 | 0.692 |
| 1.299999999999832 | 0.714 |
| 1.309999999999832 | 0.736 |
| 1.319999999999832 | 0.759 |
| 1.329999999999832 | 0.782 |
| 1.339999999999832 | 0.806 |
| 1.349999999999832 | 0.83 |
| 1.359999999999832 | 0.855 |
| 1.369999999999832 | 0.881 |
| 1.379999999999832 | 0.907 |
| 1.389999999999832 | 0.933 |
| 1.399999999999832 | 0.96 |
| 1.409999999999832 | 0.988 |
| 1.419999999999832 | 1.016 |
| 1.429999999999832 | 1.045 |
| 1.439999999999832 | 1.075 |
| 1.449999999999832 | 1.105 |
| 1.459999999999832 | 1.136 |
| 1.469999999999832 | 1.167 |
| 1.479999999999832 | 1.199 |
| 1.489999999999832 | 1.232 |
| 1.499999999999832 | 1.266 |
| 1.509999999999832 | 1.3 |
| 1.519999999999832 | 1.334 |
| 1.529999999999832 | 1.37 |
| 1.539999999999832 | 1.406 |
| 1.549999999999832 | 1.443 |
| 1.559999999999832 | 1.481 |
| 1.569999999999832 | 1.519 |
| 1.579999999999832 | 1.558 |
| 1.589999999999832 | 1.598 |
| 1.599999999999832 | 1.638 |
| 1.609999999999832 | 1.68 |
| 1.619999999999832 | 1.722 |
| 1.629999999999832 | 1.765 |
| 1.639999999999832 | 1.808 |
| 1.649999999999832 | 1.853 |
| 1.659999999999832 | 1.898 |
| 1.669999999999832 | 1.944 |
| 1.679999999999832 | 1.991 |
| 1.689999999999832 | 2.039 |
| 1.699999999999832 | 2.088 |
| 1.709999999999832 | 2.138 |
| 1.719999999999832 | 2.188 |
| 1.729999999999832 | 2.239 |
| 1.739999999999832 | 2.292 |
| 1.749999999999832 | 2.345 |
| 1.759999999999832 | 2.399 |
| 1.769999999999832 | 2.454 |
| 1.779999999999832 | 2.51 |
| 1.789999999999832 | 2.567 |
| 1.799999999999832 | 2.624 |
| 1.809999999999832 | 2.683 |
| 1.819999999999832 | 2.743 |
| 1.829999999999832 | 2.804 |
| 1.839999999999832 | 2.866 |
| 1.849999999999832 | 2.928 |
| 1.859999999999832 | 2.992 |
| 1.869999999999832 | 3.057 |
| 1.879999999999832 | 3.123 |
| 1.889999999999832 | 3.19 |
| 1.899999999999832 | 3.258 |
| 1.909999999999832 | 3.327 |
| 1.919999999999832 | 3.397 |
| 1.929999999999832 | 3.469 |
| 1.939999999999832 | 3.541 |
| 1.949999999999833 | 3.615 |
| 1.959999999999833 | 3.689 |
| 1.969999999999833 | 3.765 |
| 1.979999999999833 | 3.842 |
| 1.989999999999833 | 3.921 |
| 1.999999999999833 | 4 |
| 2.009999999999832 | 4.081 |
| 2.019999999999832 | 4.162 |
| 2.029999999999832 | 4.245 |
| 2.039999999999832 | 4.33 |
| 2.049999999999832 | 4.415 |
| 2.059999999999831 | 4.502 |
| 2.069999999999831 | 4.59 |
| 2.079999999999831 | 4.679 |
| 2.089999999999831 | 4.77 |
| 2.09999999999983 | 4.862 |
| 2.10999999999983 | 4.955 |
| 2.11999999999983 | 5.05 |
| 2.12999999999983 | 5.146 |
| 2.13999999999983 | 5.243 |
| 2.149999999999829 | 5.342 |
| 2.159999999999829 | 5.442 |
| 2.169999999999829 | 5.543 |
| 2.179999999999829 | 5.646 |
| 2.189999999999829 | 5.751 |
| 2.199999999999828 | 5.856 |
| 2.209999999999828 | 5.964 |
| 2.219999999999828 | 6.072 |
| 2.229999999999828 | 6.182 |
| 2.239999999999827 | 6.294 |
| 2.249999999999827 | 6.407 |
| 2.259999999999827 | 6.522 |
| 2.269999999999827 | 6.638 |
| 2.279999999999827 | 6.756 |
| 2.289999999999826 | 6.875 |
| 2.299999999999826 | 6.996 |
| 2.309999999999826 | 7.118 |
| 2.319999999999826 | 7.243 |
| 2.329999999999825 | 7.368 |
| 2.339999999999825 | 7.496 |
| 2.349999999999825 | 7.625 |
| 2.359999999999825 | 7.755 |
| 2.369999999999825 | 7.887 |
| 2.379999999999824 | 8.021 |
| 2.389999999999824 | 8.157 |
| 2.399999999999824 | 8.294 |
| 2.409999999999824 | 8.434 |
| 2.419999999999824 | 8.574 |
| 2.429999999999823 | 8.717 |
| 2.439999999999823 | 8.861 |
| 2.449999999999823 | 9.008 |
| 2.459999999999823 | 9.155 |
| 2.469999999999823 | 9.305 |
| 2.479999999999822 | 9.457 |
| 2.489999999999822 | 9.61 |
| 2.499999999999822 | 9.766 |
| 2.509999999999822 | 9.923 |
| 2.519999999999821 | 10.082 |
| 2.529999999999821 | 10.243 |
| 2.539999999999821 | 10.406 |
| 2.549999999999821 | 10.571 |
| 2.559999999999821 | 10.737 |
| 2.56999999999982 | 10.906 |
| 2.57999999999982 | 11.077 |
| 2.58999999999982 | 11.25 |
| 2.59999999999982 | 11.424 |
| 2.609999999999819 | 11.601 |
| 2.619999999999819 | 11.78 |
| 2.629999999999819 | 11.961 |
| 2.639999999999819 | 12.144 |
| 2.649999999999819 | 12.329 |
| 2.659999999999818 | 12.516 |
| 2.669999999999818 | 12.705 |
| 2.679999999999818 | 12.897 |
| 2.689999999999818 | 13.09 |
| 2.699999999999818 | 13.286 |
| 2.709999999999817 | 13.484 |
| 2.719999999999817 | 13.684 |
| 2.729999999999817 | 13.886 |
| 2.739999999999817 | 14.091 |
| 2.749999999999817 | 14.298 |
| 2.759999999999816 | 14.507 |
| 2.769999999999816 | 14.718 |
| 2.779999999999816 | 14.932 |
| 2.789999999999816 | 15.148 |
| 2.799999999999815 | 15.366 |
| 2.809999999999815 | 15.587 |
| 2.819999999999815 | 15.81 |
| 2.829999999999815 | 16.036 |
| 2.839999999999815 | 16.263 |
| 2.849999999999814 | 16.494 |
| 2.859999999999814 | 16.726 |
| 2.869999999999814 | 16.962 |
| 2.879999999999814 | 17.199 |
| 2.889999999999814 | 17.439 |
| 2.899999999999813 | 17.682 |
| 2.909999999999813 | 17.927 |
| 2.919999999999813 | 18.175 |
| 2.929999999999813 | 18.425 |
| 2.939999999999813 | 18.678 |
| 2.949999999999812 | 18.933 |
| 2.959999999999812 | 19.191 |
| 2.969999999999812 | 19.452 |
| 2.979999999999812 | 19.715 |
| 2.989999999999811 | 19.981 |
| 2.999999999999811 | 20.25 |
| 3.009999999999811 | 20.521 |
| 3.019999999999811 | 20.795 |
| 3.029999999999811 | 21.072 |
| 3.03999999999981 | 21.352 |
| 3.04999999999981 | 21.634 |
| 3.05999999999981 | 21.919 |
| 3.06999999999981 | 22.207 |
| 3.07999999999981 | 22.498 |
| 3.089999999999809 | 22.792 |
| 3.099999999999809 | 23.088 |
| 3.109999999999809 | 23.387 |
| 3.119999999999809 | 23.69 |
| 3.129999999999808 | 23.995 |
| 3.139999999999808 | 24.303 |
| 3.149999999999808 | 24.614 |
| 3.159999999999808 | 24.928 |
| 3.169999999999808 | 25.245 |
| 3.179999999999807 | 25.565 |
| 3.189999999999807 | 25.888 |
| 3.199999999999807 | 26.214 |
| 3.209999999999807 | 26.544 |
| 3.219999999999807 | 26.876 |
| 3.229999999999806 | 27.211 |
| 3.239999999999806 | 27.55 |
| 3.249999999999806 | 27.892 |
| 3.259999999999806 | 28.236 |
| 3.269999999999805 | 28.585 |
| 3.279999999999805 | 28.936 |
| 3.289999999999805 | 29.29 |
| 3.299999999999805 | 29.648 |
| 3.309999999999805 | 30.009 |
| 3.319999999999804 | 30.373 |
| 3.329999999999804 | 30.741 |
| 3.339999999999804 | 31.112 |
| 3.349999999999804 | 31.486 |
| 3.359999999999804 | 31.864 |
| 3.369999999999803 | 32.245 |
| 3.379999999999803 | 32.629 |
| 3.389999999999803 | 33.017 |
| 3.399999999999803 | 33.408 |
| 3.409999999999802 | 33.803 |
| 3.419999999999802 | 34.201 |
| 3.429999999999802 | 34.603 |
| 3.439999999999802 | 35.009 |
| 3.449999999999802 | 35.417 |
| 3.459999999999801 | 35.83 |
| 3.469999999999801 | 36.246 |
| 3.479999999999801 | 36.665 |
| 3.489999999999801 | 37.089 |
| 3.499999999999801 | 37.516 |
| 3.5099999999998 | 37.946 |
| 3.5199999999998 | 38.381 |
| 3.5299999999998 | 38.819 |
| 3.5399999999998 | 39.26 |
| 3.5499999999998 | 39.706 |
| 3.559999999999799 | 40.155 |
| 3.569999999999799 | 40.608 |
| 3.579999999999799 | 41.065 |
| 3.589999999999799 | 41.526 |
| 3.599999999999798 | 41.99 |
| 3.609999999999798 | 42.459 |
| 3.619999999999798 | 42.931 |
| 3.629999999999798 | 43.408 |
| 3.639999999999798 | 43.888 |
| 3.649999999999797 | 44.372 |
| 3.659999999999797 | 44.861 |
| 3.669999999999797 | 45.353 |
| 3.679999999999797 | 45.849 |
| 3.689999999999796 | 46.35 |
| 3.699999999999796 | 46.854 |
| 3.709999999999796 | 47.363 |
| 3.719999999999796 | 47.875 |
| 3.729999999999796 | 48.392 |
| 3.739999999999795 | 48.913 |
| 3.749999999999795 | 49.438 |
| 3.759999999999795 | 49.968 |
| 3.769999999999795 | 50.502 |
| 3.779999999999795 | 51.04 |
| 3.789999999999794 | 51.582 |
| 3.799999999999794 | 52.128 |
| 3.809999999999794 | 52.679 |
| 3.819999999999794 | 53.235 |
| 3.829999999999794 | 53.794 |
| 3.839999999999793 | 54.358 |
| 3.849999999999793 | 54.927 |
| 3.859999999999793 | 55.5 |
| 3.869999999999793 | 56.077 |
| 3.879999999999792 | 56.659 |
| 3.889999999999792 | 57.245 |
| 3.899999999999792 | 57.836 |
| 3.909999999999792 | 58.432 |
| 3.919999999999792 | 59.032 |
| 3.929999999999791 | 59.636 |
| 3.939999999999791 | 60.246 |
| 3.949999999999791 | 60.86 |
| 3.959999999999791 | 61.478 |
| 3.969999999999791 | 62.101 |
| 3.97999999999979 | 62.73 |
| 3.98999999999979 | 63.362 |
| 3.99999999999979 | 64 |
| 4.00999999999979 | 64.642 |
| 4.01999999999979 | 65.29 |
| 4.02999999999979 | 65.942 |
| 4.03999999999979 | 66.599 |
| 4.04999999999979 | 67.261 |
| 4.05999999999979 | 67.927 |
| 4.069999999999789 | 68.599 |
| 4.079999999999788 | 69.276 |
| 4.089999999999788 | 69.957 |
| 4.099999999999788 | 70.644 |
| 4.109999999999788 | 71.336 |
| 4.119999999999788 | 72.033 |
| 4.129999999999788 | 72.734 |
| 4.139999999999787 | 73.441 |
| 4.149999999999787 | 74.154 |
| 4.159999999999787 | 74.871 |
| 4.169999999999787 | 75.593 |
| 4.179999999999786 | 76.321 |
| 4.189999999999786 | 77.054 |
| 4.199999999999786 | 77.792 |
| 4.209999999999785 | 78.536 |
| 4.219999999999785 | 79.285 |
| 4.229999999999785 | 80.039 |
| 4.239999999999785 | 80.799 |
| 4.249999999999785 | 81.563 |
| 4.259999999999784 | 82.334 |
| 4.269999999999784 | 83.11 |
| 4.279999999999784 | 83.891 |
| 4.289999999999784 | 84.678 |
| 4.299999999999784 | 85.47 |
| 4.309999999999784 | 86.268 |
| 4.319999999999784 | 87.071 |
| 4.329999999999783 | 87.88 |
| 4.339999999999783 | 88.695 |
| 4.349999999999783 | 89.515 |
| 4.359999999999783 | 90.341 |
| 4.369999999999782 | 91.173 |
| 4.379999999999782 | 92.01 |
| 4.389999999999782 | 92.853 |
| 4.399999999999782 | 93.702 |
| 4.409999999999781 | 94.557 |
| 4.419999999999781 | 95.418 |
| 4.429999999999781 | 96.284 |
| 4.43999999999978 | 97.157 |
| 4.44999999999978 | 98.035 |
| 4.45999999999978 | 98.919 |
| 4.46999999999978 | 99.809 |
| 4.47999999999978 | 100.705 |
| 4.48999999999978 | 101.607 |
| 4.49999999999978 | 102.516 |
| 4.50999999999978 | 103.43 |
| 4.51999999999978 | 104.35 |
| 4.52999999999978 | 105.277 |
| 4.539999999999778 | 106.21 |
| 4.549999999999778 | 107.148 |
| 4.559999999999778 | 108.093 |
| 4.569999999999778 | 109.045 |
| 4.579999999999778 | 110.002 |
| 4.589999999999777 | 110.966 |
| 4.599999999999777 | 111.936 |
| 4.609999999999777 | 112.913 |
| 4.619999999999777 | 113.896 |
| 4.629999999999777 | 114.885 |
| 4.639999999999776 | 115.881 |
| 4.649999999999776 | 116.883 |
| 4.659999999999776 | 117.892 |
| 4.669999999999776 | 118.907 |
| 4.679999999999775 | 119.929 |
| 4.689999999999775 | 120.957 |
| 4.699999999999775 | 121.992 |
| 4.709999999999775 | 123.034 |
| 4.719999999999774 | 124.082 |
| 4.729999999999774 | 125.137 |
| 4.739999999999774 | 126.198 |
| 4.749999999999774 | 127.267 |
| 4.759999999999774 | 128.342 |
| 4.769999999999774 | 129.424 |
| 4.779999999999773 | 130.512 |
| 4.789999999999773 | 131.608 |
| 4.799999999999773 | 132.71 |
| 4.809999999999773 | 133.82 |
| 4.819999999999773 | 134.936 |
| 4.829999999999773 | 136.059 |
| 4.839999999999772 | 137.19 |
| 4.849999999999772 | 138.327 |
| 4.859999999999772 | 139.471 |
| 4.869999999999772 | 140.623 |
| 4.879999999999771 | 141.781 |
| 4.889999999999771 | 142.947 |
| 4.899999999999771 | 144.12 |
| 4.90999999999977 | 145.3 |
| 4.91999999999977 | 146.487 |
| 4.92999999999977 | 147.682 |
| 4.93999999999977 | 148.884 |
| 4.94999999999977 | 150.093 |
| 4.95999999999977 | 151.31 |
| 4.96999999999977 | 152.534 |
| 4.97999999999977 | 153.765 |
| 4.98999999999977 | 155.004 |
| 4.99999999999977 | 156.25 |
| 5.009999999999768 | 157.504 |
| 5.019999999999768 | 158.765 |
| 5.029999999999768 | 160.034 |
| 5.039999999999768 | 161.31 |
| 5.049999999999767 | 162.594 |
| 5.059999999999767 | 163.886 |
| 5.069999999999767 | 165.185 |
| 5.079999999999767 | 166.493 |
| 5.089999999999767 | 167.807 |
| 5.099999999999766 | 169.13 |
| 5.109999999999766 | 170.46 |
| 5.119999999999766 | 171.799 |
| 5.129999999999766 | 173.145 |
| 5.139999999999766 | 174.499 |
| 5.149999999999765 | 175.861 |
| 5.159999999999765 | 177.231 |
| 5.169999999999765 | 178.609 |
| 5.179999999999765 | 179.994 |
| 5.189999999999764 | 181.388 |
| 5.199999999999764 | 182.79 |
| 5.209999999999764 | 184.201 |
| 5.219999999999764 | 185.619 |
| 5.229999999999764 | 187.045 |
| 5.239999999999763 | 188.48 |
| 5.249999999999763 | 189.923 |
| 5.259999999999763 | 191.374 |
| 5.269999999999763 | 192.833 |
| 5.279999999999763 | 194.301 |
| 5.289999999999762 | 195.777 |
| 5.299999999999762 | 197.262 |
| 5.309999999999762 | 198.755 |
| 5.319999999999762 | 200.256 |
| 5.329999999999762 | 201.766 |
| 5.339999999999761 | 203.285 |
| 5.349999999999761 | 204.812 |
| 5.359999999999761 | 206.347 |
| 5.369999999999761 | 207.892 |
| 5.37999999999976 | 209.445 |
| 5.38999999999976 | 211.006 |
| 5.39999999999976 | 212.576 |
| 5.40999999999976 | 214.155 |
| 5.41999999999976 | 215.743 |
| 5.42999999999976 | 217.34 |
| 5.43999999999976 | 218.945 |
| 5.44999999999976 | 220.56 |
| 5.45999999999976 | 222.183 |
| 5.46999999999976 | 223.815 |
| 5.479999999999758 | 225.456 |
| 5.489999999999758 | 227.106 |
| 5.499999999999758 | 228.766 |
| 5.509999999999758 | 230.434 |
| 5.519999999999758 | 232.111 |
| 5.529999999999758 | 233.798 |
| 5.539999999999757 | 235.494 |
| 5.549999999999757 | 237.199 |
| 5.559999999999757 | 238.913 |
| 5.569999999999757 | 240.636 |
| 5.579999999999756 | 242.369 |
| 5.589999999999756 | 244.111 |
| 5.599999999999756 | 245.862 |
| 5.609999999999756 | 247.623 |
| 5.619999999999756 | 249.394 |
| 5.629999999999756 | 251.173 |
| 5.639999999999755 | 252.963 |
| 5.649999999999755 | 254.762 |
| 5.659999999999755 | 256.57 |
| 5.669999999999755 | 258.388 |
| 5.679999999999754 | 260.216 |
| 5.689999999999754 | 262.053 |
| 5.699999999999754 | 263.9 |
| 5.709999999999754 | 265.757 |
| 5.719999999999754 | 267.623 |
| 5.729999999999753 | 269.5 |
| 5.739999999999753 | 271.386 |
| 5.749999999999753 | 273.282 |
| 5.759999999999753 | 275.188 |
| 5.769999999999753 | 277.104 |
| 5.779999999999752 | 279.03 |
| 5.789999999999752 | 280.966 |
| 5.799999999999752 | 282.912 |
| 5.809999999999752 | 284.869 |
| 5.819999999999752 | 286.835 |
| 5.829999999999751 | 288.811 |
| 5.839999999999751 | 290.798 |
| 5.849999999999751 | 292.795 |
| 5.859999999999751 | 294.802 |
| 5.86999999999975 | 296.819 |
| 5.87999999999975 | 298.847 |
| 5.88999999999975 | 300.885 |
| 5.89999999999975 | 302.934 |
| 5.90999999999975 | 304.993 |
| 5.91999999999975 | 307.063 |
| 5.92999999999975 | 309.143 |
| 5.93999999999975 | 311.233 |
| 5.949999999999748 | 313.334 |
| 5.959999999999748 | 315.446 |
| 5.969999999999748 | 317.568 |
| 5.979999999999748 | 319.702 |
| 5.989999999999747 | 321.845 |
| 5.999999999999747 | 324 |
| 6.009999999999747 | 326.165 |
| 6.019999999999747 | 328.342 |
| 6.029999999999747 | 330.529 |
| 6.039999999999746 | 332.727 |
| 6.049999999999746 | 334.936 |
| 6.059999999999746 | 337.156 |
| 6.069999999999746 | 339.387 |
| 6.079999999999746 | 341.629 |
| 6.089999999999745 | 343.882 |
| 6.099999999999745 | 346.146 |
| 6.109999999999745 | 348.421 |
| 6.119999999999745 | 350.708 |
| 6.129999999999745 | 353.006 |
| 6.139999999999744 | 355.315 |
| 6.149999999999744 | 357.635 |
| 6.159999999999744 | 359.967 |
| 6.169999999999744 | 362.31 |
| 6.179999999999744 | 364.665 |
| 6.189999999999744 | 367.031 |
| 6.199999999999743 | 369.408 |
| 6.209999999999743 | 371.797 |
| 6.219999999999743 | 374.198 |
| 6.229999999999743 | 376.61 |
| 6.239999999999742 | 379.034 |
| 6.249999999999742 | 381.47 |
| 6.259999999999742 | 383.917 |
| 6.269999999999742 | 386.376 |
| 6.279999999999741 | 388.847 |
| 6.289999999999741 | 391.33 |
| 6.299999999999741 | 393.824 |
| 6.309999999999741 | 396.33 |
| 6.319999999999741 | 398.849 |
| 6.329999999999741 | 401.379 |
| 6.33999999999974 | 403.922 |
| 6.34999999999974 | 406.476 |
| 6.35999999999974 | 409.043 |
| 6.36999999999974 | 411.621 |
| 6.37999999999974 | 414.212 |
| 6.38999999999974 | 416.815 |
| 6.39999999999974 | 419.43 |
| 6.409999999999738 | 422.058 |
| 6.419999999999738 | 424.698 |
| 6.429999999999738 | 427.35 |
| 6.439999999999738 | 430.015 |
| 6.449999999999738 | 432.692 |
| 6.459999999999737 | 435.382 |
| 6.469999999999737 | 438.084 |
| 6.479999999999737 | 440.798 |
| 6.489999999999737 | 443.526 |
| 6.499999999999737 | 446.266 |
| 6.509999999999736 | 449.018 |
| 6.519999999999736 | 451.784 |
| 6.529999999999736 | 454.562 |
| 6.539999999999736 | 457.352 |
| 6.549999999999736 | 460.156 |
| 6.559999999999735 | 462.973 |
| 6.569999999999735 | 465.802 |
| 6.579999999999735 | 468.645 |
| 6.589999999999735 | 471.5 |
| 6.599999999999734 | 474.368 |
| 6.609999999999734 | 477.25 |
| 6.619999999999734 | 480.145 |
| 6.629999999999734 | 483.052 |
| 6.639999999999734 | 485.973 |
| 6.649999999999734 | 488.907 |
| 6.659999999999734 | 491.855 |
| 6.669999999999733 | 494.816 |
| 6.679999999999733 | 497.79 |
| 6.689999999999733 | 500.777 |
| 6.699999999999733 | 503.778 |
| 6.709999999999732 | 506.792 |
| 6.719999999999732 | 509.82 |
| 6.729999999999732 | 512.862 |
| 6.739999999999731 | 515.917 |
| 6.749999999999731 | 518.985 |
| 6.759999999999731 | 522.068 |
| 6.769999999999731 | 525.164 |
| 6.77999999999973 | 528.273 |
| 6.78999999999973 | 531.397 |
| 6.79999999999973 | 534.534 |
| 6.80999999999973 | 537.686 |
| 6.81999999999973 | 540.851 |
| 6.82999999999973 | 544.03 |
| 6.83999999999973 | 547.223 |
| 6.84999999999973 | 550.43 |
| 6.85999999999973 | 553.651 |
| 6.86999999999973 | 556.887 |
| 6.879999999999728 | 560.136 |
| 6.889999999999728 | 563.4 |
| 6.899999999999728 | 566.678 |
| 6.909999999999728 | 569.97 |
| 6.919999999999728 | 573.277 |
| 6.929999999999727 | 576.598 |
| 6.939999999999727 | 579.933 |
| 6.949999999999727 | 583.283 |
| 6.959999999999727 | 586.647 |
| 6.969999999999727 | 590.026 |
| 6.979999999999726 | 593.419 |
| 6.989999999999726 | 596.827 |
| 6.999999999999726 | 600.25 |
| 7.009999999999726 | 603.687 |
| 7.019999999999726 | 607.139 |
| 7.029999999999725 | 610.606 |
| 7.039999999999725 | 614.088 |
| 7.049999999999725 | 617.585 |
| 7.059999999999725 | 621.096 |
| 7.069999999999724 | 624.623 |
| 7.079999999999724 | 628.164 |
| 7.089999999999724 | 631.72 |
| 7.099999999999724 | 635.292 |
| 7.109999999999724 | 638.879 |
| 7.119999999999724 | 642.481 |
| 7.129999999999724 | 646.098 |
| 7.139999999999723 | 649.73 |
| 7.149999999999723 | 653.378 |
| 7.159999999999723 | 657.04 |
| 7.169999999999723 | 660.719 |
| 7.179999999999722 | 664.412 |
| 7.189999999999722 | 668.122 |
| 7.199999999999722 | 671.846 |
| 7.209999999999721 | 675.587 |
| 7.219999999999721 | 679.343 |
| 7.229999999999721 | 683.114 |
| 7.23999999999972 | 686.901 |
| 7.24999999999972 | 690.704 |
| 7.25999999999972 | 694.523 |
| 7.26999999999972 | 698.357 |
| 7.27999999999972 | 702.208 |
| 7.28999999999972 | 706.074 |
| 7.29999999999972 | 709.956 |
| 7.30999999999972 | 713.854 |
| 7.31999999999972 | 717.768 |
| 7.329999999999719 | 721.699 |
| 7.33999999999972 | 725.645 |
| 7.349999999999719 | 729.608 |
| 7.359999999999719 | 733.586 |
| 7.369999999999718 | 737.581 |
| 7.379999999999718 | 741.593 |
| 7.389999999999718 | 745.62 |
| 7.399999999999718 | 749.664 |
| 7.409999999999717 | 753.725 |
| 7.419999999999717 | 757.802 |
| 7.429999999999717 | 761.895 |
| 7.439999999999717 | 766.005 |
| 7.449999999999716 | 770.132 |
| 7.459999999999716 | 774.275 |
| 7.469999999999716 | 778.435 |
| 7.479999999999716 | 782.612 |
| 7.489999999999715 | 786.805 |
| 7.499999999999715 | 791.016 |
| 7.509999999999715 | 795.243 |
| 7.519999999999715 | 799.487 |
| 7.529999999999715 | 803.748 |
| 7.539999999999714 | 808.026 |
| 7.549999999999714 | 812.321 |
| 7.559999999999714 | 816.633 |
| 7.569999999999714 | 820.963 |
| 7.579999999999714 | 825.309 |
| 7.589999999999714 | 829.673 |
| 7.599999999999714 | 834.054 |
| 7.609999999999713 | 838.453 |
| 7.619999999999713 | 842.869 |
| 7.629999999999713 | 847.302 |
| 7.639999999999713 | 851.753 |
| 7.649999999999712 | 856.221 |
| 7.659999999999712 | 860.707 |
| 7.669999999999712 | 865.21 |
| 7.679999999999712 | 869.731 |
| 7.689999999999712 | 874.27 |
| 7.699999999999711 | 878.826 |
| 7.709999999999711 | 883.4 |
| 7.719999999999711 | 887.992 |
| 7.729999999999711 | 892.602 |
| 7.73999999999971 | 897.23 |
| 7.74999999999971 | 901.876 |
| 7.75999999999971 | 906.54 |
| 7.76999999999971 | 911.222 |
| 7.77999999999971 | 915.922 |
| 7.78999999999971 | 920.64 |
| 7.79999999999971 | 925.376 |
| 7.80999999999971 | 930.131 |
| 7.819999999999709 | 934.904 |
| 7.829999999999709 | 939.695 |
| 7.839999999999708 | 944.505 |
| 7.849999999999708 | 949.333 |
| 7.859999999999708 | 954.18 |
| 7.869999999999708 | 959.045 |
| 7.879999999999707 | 963.929 |
| 7.889999999999707 | 968.831 |
| 7.899999999999707 | 973.752 |
| 7.909999999999707 | 978.692 |
| 7.919999999999706 | 983.65 |
| 7.929999999999706 | 988.628 |
| 7.939999999999706 | 993.624 |
| 7.949999999999706 | 998.639 |
| 7.959999999999705 | 1003.673 |
| 7.969999999999705 | 1008.726 |
| 7.979999999999705 | 1013.798 |
| 7.989999999999705 | 1018.89 |
| 7.999999999999705 | 1024 |
| 8.009999999999703 | 1029.13 |
| 8.019999999999705 | 1034.278 |
| 8.029999999999704 | 1039.447 |
| 8.039999999999704 | 1044.634 |
| 8.049999999999704 | 1049.841 |
| 8.059999999999704 | 1055.067 |
| 8.069999999999704 | 1060.313 |
| 8.079999999999703 | 1065.579 |
| 8.089999999999703 | 1070.863 |
| 8.099999999999701 | 1076.168 |
| 8.109999999999703 | 1081.492 |
| 8.119999999999703 | 1086.836 |
| 8.129999999999702 | 1092.2 |
| 8.139999999999702 | 1097.584 |
| 8.1499999999997 | 1102.987 |
| 8.1599999999997 | 1108.411 |
| 8.1699999999997 | 1113.854 |
| 8.1799999999997 | 1119.317 |
| 8.1899999999997 | 1124.801 |
| 8.1999999999997 | 1130.304 |
| 8.2099999999997 | 1135.828 |
| 8.2199999999997 | 1141.372 |
| 8.2299999999997 | 1146.936 |
| 8.2399999999997 | 1152.521 |
| 8.2499999999997 | 1158.126 |
| 8.2599999999997 | 1163.751 |
| 8.2699999999997 | 1169.397 |
| 8.2799999999997 | 1175.064 |
| 8.289999999999697 | 1180.75 |
| 8.299999999999699 | 1186.458 |
| 8.309999999999699 | 1192.186 |
| 8.319999999999698 | 1197.935 |
| 8.329999999999698 | 1203.705 |
| 8.339999999999698 | 1209.495 |
| 8.349999999999698 | 1215.307 |
| 8.359999999999697 | 1221.139 |
| 8.369999999999697 | 1226.992 |
| 8.379999999999695 | 1232.867 |
| 8.389999999999697 | 1238.762 |
| 8.399999999999697 | 1244.678 |
| 8.409999999999696 | 1250.616 |
| 8.419999999999696 | 1256.575 |
| 8.429999999999694 | 1262.555 |
| 8.439999999999696 | 1268.556 |
| 8.449999999999696 | 1274.579 |
| 8.459999999999695 | 1280.623 |
| 8.469999999999695 | 1286.689 |
| 8.479999999999693 | 1292.776 |
| 8.489999999999695 | 1298.885 |
| 8.499999999999694 | 1305.016 |
| 8.509999999999694 | 1311.168 |
| 8.519999999999694 | 1317.342 |
| 8.529999999999694 | 1323.537 |
| 8.539999999999694 | 1329.755 |
| 8.549999999999693 | 1335.994 |
| 8.55999999999969 | 1342.255 |
| 8.56999999999969 | 1348.538 |
| 8.57999999999969 | 1354.844 |
| 8.58999999999969 | 1361.171 |
| 8.59999999999969 | 1367.52 |
| 8.60999999999969 | 1373.892 |
| 8.61999999999969 | 1380.286 |
| 8.62999999999969 | 1386.702 |
| 8.63999999999969 | 1393.141 |
| 8.64999999999969 | 1399.602 |
| 8.65999999999969 | 1406.085 |
| 8.66999999999969 | 1412.591 |
| 8.67999999999969 | 1419.119 |
| 8.68999999999969 | 1425.67 |
| 8.69999999999969 | 1432.244 |
| 8.70999999999969 | 1438.84 |
| 8.71999999999969 | 1445.46 |
| 8.72999999999969 | 1452.102 |
| 8.73999999999969 | 1458.766 |
| 8.74999999999969 | 1465.454 |
| 8.759999999999687 | 1472.165 |
| 8.769999999999689 | 1478.899 |
| 8.779999999999688 | 1485.655 |
| 8.789999999999688 | 1492.435 |
| 8.799999999999686 | 1499.238 |
| 8.809999999999688 | 1506.065 |
| 8.819999999999688 | 1512.914 |
| 8.829999999999687 | 1519.787 |
| 8.839999999999687 | 1526.684 |
| 8.849999999999685 | 1533.604 |
| 8.859999999999687 | 1540.547 |
| 8.869999999999687 | 1547.514 |
| 8.879999999999686 | 1554.504 |
| 8.889999999999686 | 1561.518 |
| 8.899999999999684 | 1568.556 |
| 8.909999999999686 | 1575.618 |
| 8.919999999999686 | 1582.703 |
| 8.929999999999685 | 1589.812 |
| 8.939999999999685 | 1596.945 |
| 8.949999999999685 | 1604.103 |
| 8.959999999999685 | 1611.284 |
| 8.969999999999684 | 1618.489 |
| 8.979999999999684 | 1625.719 |
| 8.989999999999682 | 1632.972 |
| 8.999999999999684 | 1640.25 |
| 9.009999999999684 | 1647.552 |
| 9.019999999999683 | 1654.879 |
| 9.029999999999683 | 1662.23 |
| 9.039999999999681 | 1669.605 |
| 9.049999999999683 | 1677.005 |
| 9.05999999999968 | 1684.429 |
| 9.06999999999968 | 1691.878 |
| 9.07999999999968 | 1699.352 |
| 9.08999999999968 | 1706.851 |
| 9.09999999999968 | 1714.374 |
| 9.10999999999968 | 1721.922 |
| 9.11999999999968 | 1729.495 |
| 9.12999999999968 | 1737.093 |
| 9.13999999999968 | 1744.716 |
| 9.14999999999968 | 1752.364 |
| 9.15999999999968 | 1760.037 |
| 9.16999999999968 | 1767.736 |
| 9.17999999999968 | 1775.459 |
| 9.18999999999968 | 1783.208 |
| 9.19999999999968 | 1790.982 |
| 9.20999999999968 | 1798.782 |
| 9.21999999999968 | 1806.607 |
| 9.229999999999677 | 1814.458 |
| 9.239999999999679 | 1822.334 |
| 9.249999999999678 | 1830.235 |
| 9.259999999999678 | 1838.163 |
| 9.269999999999678 | 1846.116 |
| 9.279999999999678 | 1854.095 |
| 9.289999999999678 | 1862.099 |
| 9.299999999999677 | 1870.13 |
| 9.309999999999677 | 1878.187 |
| 9.319999999999675 | 1886.269 |
| 9.329999999999677 | 1894.378 |
| 9.339999999999677 | 1902.512 |
| 9.349999999999676 | 1910.673 |
| 9.359999999999676 | 1918.861 |
| 9.369999999999674 | 1927.074 |
| 9.379999999999676 | 1935.314 |
| 9.389999999999675 | 1943.58 |
| 9.399999999999675 | 1951.872 |
| 9.409999999999675 | 1960.192 |
| 9.419999999999675 | 1968.537 |
| 9.429999999999675 | 1976.909 |
| 9.439999999999674 | 1985.308 |
| 9.449999999999674 | 1993.734 |
| 9.459999999999672 | 2002.187 |
| 9.469999999999674 | 2010.666 |
| 9.479999999999674 | 2019.172 |
| 9.489999999999673 | 2027.705 |
| 9.499999999999673 | 2036.266 |
| 9.509999999999671 | 2044.853 |
| 9.519999999999673 | 2053.467 |
| 9.529999999999673 | 2062.109 |
| 9.539999999999672 | 2070.778 |
| 9.549999999999672 | 2079.474 |
| 9.55999999999967 | 2088.198 |
| 9.56999999999967 | 2096.948 |
| 9.57999999999967 | 2105.727 |
| 9.58999999999967 | 2114.533 |
| 9.59999999999967 | 2123.366 |
| 9.60999999999967 | 2132.228 |
| 9.61999999999967 | 2141.116 |
| 9.62999999999967 | 2150.033 |
| 9.63999999999967 | 2158.978 |
| 9.64999999999967 | 2167.95 |
| 9.65999999999967 | 2176.95 |
| 9.66999999999967 | 2185.979 |
| 9.67999999999967 | 2195.035 |
| 9.689999999999667 | 2204.119 |
| 9.699999999999669 | 2213.232 |
| 9.709999999999669 | 2222.373 |
| 9.719999999999668 | 2231.542 |
| 9.729999999999668 | 2240.739 |
| 9.739999999999666 | 2249.965 |
| 9.749999999999668 | 2259.22 |
| 9.759999999999668 | 2268.503 |
| 9.769999999999667 | 2277.814 |
| 9.779999999999667 | 2287.154 |
| 9.789999999999665 | 2296.523 |
| 9.799999999999667 | 2305.92 |
| 9.809999999999667 | 2315.347 |
| 9.819999999999666 | 2324.802 |
| 9.829999999999666 | 2334.286 |
| 9.839999999999664 | 2343.799 |
| 9.849999999999666 | 2353.341 |
| 9.859999999999665 | 2362.913 |
| 9.869999999999665 | 2372.513 |
| 9.879999999999663 | 2382.143 |
| 9.889999999999665 | 2391.802 |
| 9.899999999999665 | 2401.49 |
| 9.909999999999664 | 2411.208 |
| 9.919999999999664 | 2420.955 |
| 9.929999999999662 | 2430.732 |
| 9.939999999999664 | 2440.538 |
| 9.949999999999664 | 2450.374 |
| 9.95999999999966 | 2460.239 |
| 9.96999999999966 | 2470.135 |
| 9.97999999999966 | 2480.06 |
| 9.98999999999966 | 2490.015 |
| 9.99999999999966 | 2500 |